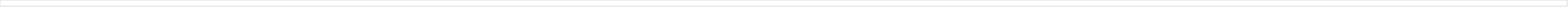
| Category | Series 0 |
|---|---|
| 0.0 | 0 |
| 4.0 | 0.381 |
| 5.0 | 0.095 |
| 6.0 | 0 |
| 7.0 | 0.429 |
| 0.0 | 0 |
| 11.0 | 0.143 |
| 12.0 | 0.476 |
| 13.0 | 0.286 |
| 14.0 | 0.667 |
| 0.0 | 0 |
| 18.0 | 0.095 |
| 19.0 | 0.238 |
| 20.0 | 0.714 |
| 21.0 | 0.476 |
| 0.0 | 0 |
| 24.0 | 0.286 |
| 25.0 | 0.381 |
| 0.0 | 0 |
| 28.0 | 0.429 |
| 29.0 | 0.762 |
| 30.0 | 0.619 |
| 31.0 | 0.762 |
| 32.0 | 0.381 |
| 0.0 | 0 |
| 0.0 | 0 |
| 0.0 | 0 |
| 0.0 | 0 |
| 0.0 | 0 |
| 0.0 | 0 |